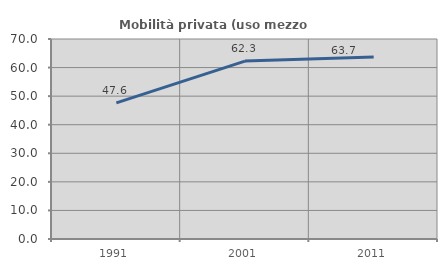
| Category | Mobilità privata (uso mezzo privato) |
|---|---|
| 1991.0 | 47.619 |
| 2001.0 | 62.264 |
| 2011.0 | 63.67 |